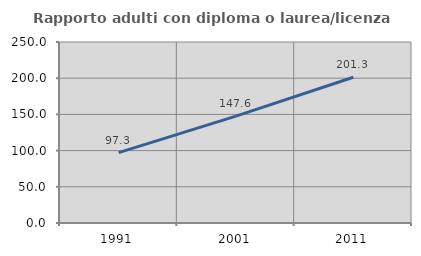
| Category | Rapporto adulti con diploma o laurea/licenza media  |
|---|---|
| 1991.0 | 97.273 |
| 2001.0 | 147.619 |
| 2011.0 | 201.277 |